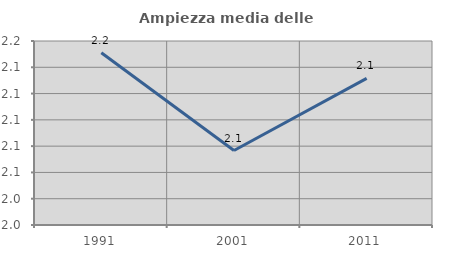
| Category | Ampiezza media delle famiglie |
|---|---|
| 1991.0 | 2.151 |
| 2001.0 | 2.077 |
| 2011.0 | 2.132 |